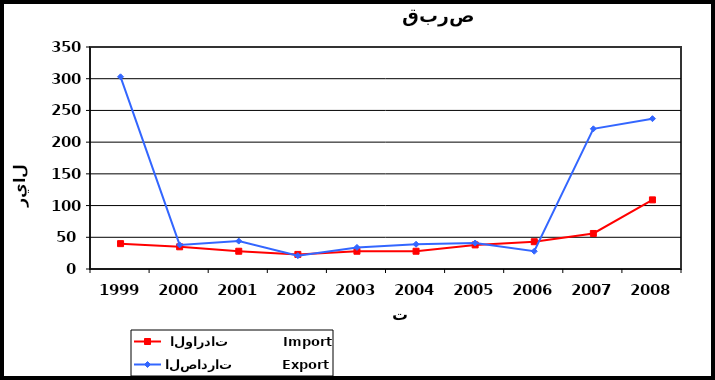
| Category |  الواردات           Import | الصادرات          Export |
|---|---|---|
| 1999.0 | 40 | 303 |
| 2000.0 | 35 | 38 |
| 2001.0 | 28 | 44 |
| 2002.0 | 23 | 21 |
| 2003.0 | 28 | 34 |
| 2004.0 | 28 | 39 |
| 2005.0 | 38 | 41 |
| 2006.0 | 43 | 28 |
| 2007.0 | 56 | 221 |
| 2008.0 | 109 | 237 |